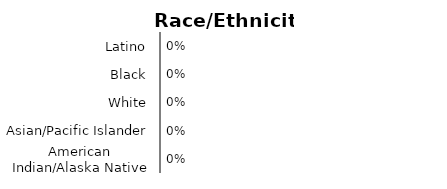
| Category | Series 0 |
|---|---|
| American Indian/Alaska Native | 0 |
| Asian/Pacific Islander | 0 |
| White | 0 |
| Black | 0 |
| Latino | 0 |